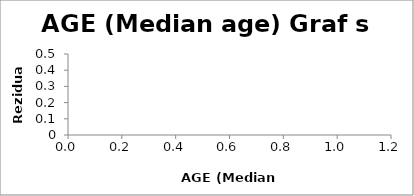
| Category | Series 0 |
|---|---|
|  | 0.432 |
|  | -4.092 |
|  | -2.364 |
|  | -0.295 |
|  | 4.51 |
|  | -2.739 |
|  | 0.633 |
|  | -0.289 |
|  | -1.084 |
|  | 0.945 |
|  | 5.511 |
|  | 3.757 |
|  | 4.013 |
|  | 1.871 |
|  | 2.605 |
|  | 1.996 |
|  | 0.655 |
|  | 3.566 |
|  | 1.606 |
|  | -4.817 |
|  | -1.481 |
|  | 1.121 |
|  | -6.326 |
|  | -3.697 |
|  | -1.285 |
|  | -3.569 |
|  | 2.231 |
|  | -1.69 |
|  | -4.005 |
|  | 2.279 |